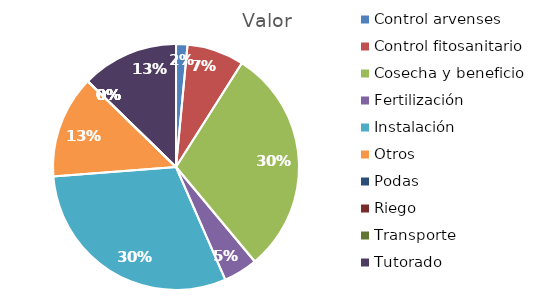
| Category | Valor |
|---|---|
| Control arvenses | 124632 |
| Control fitosanitario | 623160 |
| Cosecha y beneficio | 2492000 |
| Fertilización | 373896 |
| Instalación | 2524638 |
| Otros | 1121688 |
| Podas | 0 |
| Riego | 0 |
| Transporte | 0 |
| Tutorado | 1059372 |